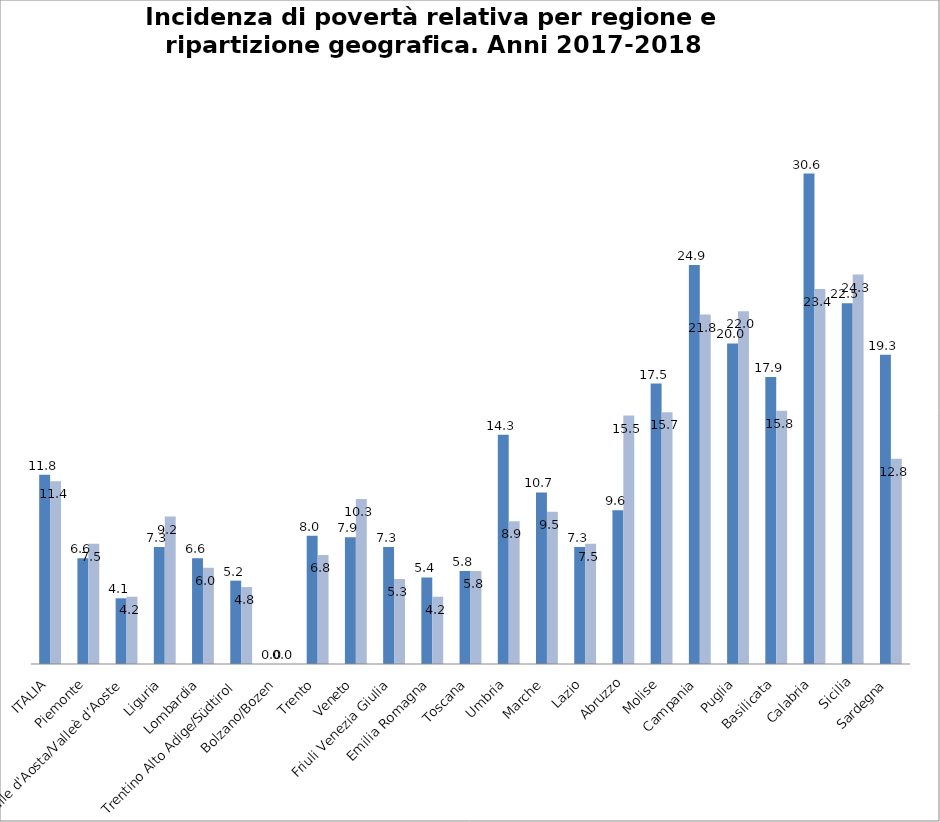
| Category | 2017 | 2018 |
|---|---|---|
| ITALIA | 11.8 | 11.4 |
| Piemonte | 6.6 | 7.5 |
| Valle d'Aosta/Valleè d’Aoste | 4.1 | 4.2 |
| Liguria | 7.3 | 9.2 |
| Lombardia | 6.6 | 6 |
| Trentino Alto Adige/Südtirol | 5.2 | 4.8 |
| Bolzano/Bozen | 0 | 0 |
| Trento | 8 | 6.8 |
| Veneto | 7.9 | 10.3 |
| Friuli Venezia Giulia | 7.3 | 5.3 |
| Emilia Romagna | 5.4 | 4.2 |
| Toscana | 5.8 | 5.8 |
| Umbria | 14.3 | 8.9 |
| Marche | 10.7 | 9.5 |
| Lazio | 7.3 | 7.5 |
| Abruzzo | 9.6 | 15.5 |
| Molise | 17.5 | 15.7 |
| Campania | 24.9 | 21.8 |
| Puglia | 20 | 22 |
| Basilicata | 17.9 | 15.8 |
| Calabria | 30.6 | 23.4 |
| Sicilia | 22.5 | 24.3 |
| Sardegna | 19.3 | 12.8 |